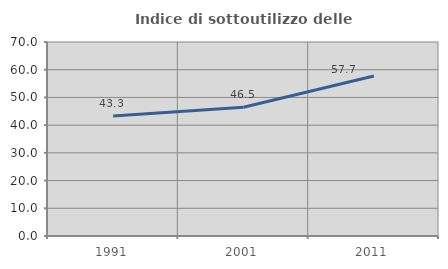
| Category | Indice di sottoutilizzo delle abitazioni  |
|---|---|
| 1991.0 | 43.258 |
| 2001.0 | 46.459 |
| 2011.0 | 57.708 |